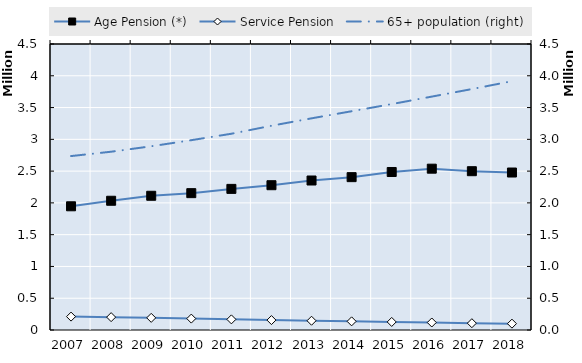
| Category | Age Pension (*) | Service Pension | 0 | Series 14 | Series 15 | Series 16 | Series 17 | Series 18 | Series 19 |
|---|---|---|---|---|---|---|---|---|---|
| 2007.0 | 1946591 | 210562 |  |  |  |  |  |  |  |
| 2008.0 | 2033445 | 202539 |  |  |  |  |  |  |  |
| 2009.0 | 2112025 | 191025 |  |  |  |  |  |  |  |
| 2010.0 | 2153175 | 179242 |  |  |  |  |  |  |  |
| 2011.0 | 2220384 | 167368 |  |  |  |  |  |  |  |
| 2012.0 | 2278215 | 156056 |  |  |  |  |  |  |  |
| 2013.0 | 2352139 | 145697 |  |  |  |  |  |  |  |
| 2014.0 | 2404902 | 136168 |  |  |  |  |  |  |  |
| 2015.0 | 2486195 | 126647 |  |  |  |  |  |  |  |
| 2016.0 | 2538161 | 118174 |  |  |  |  |  |  |  |
| 2017.0 | 2498765 | 106970 |  |  |  |  |  |  |  |
| 2018.0 | 2477861 | 99939 |  |  |  |  |  |  |  |